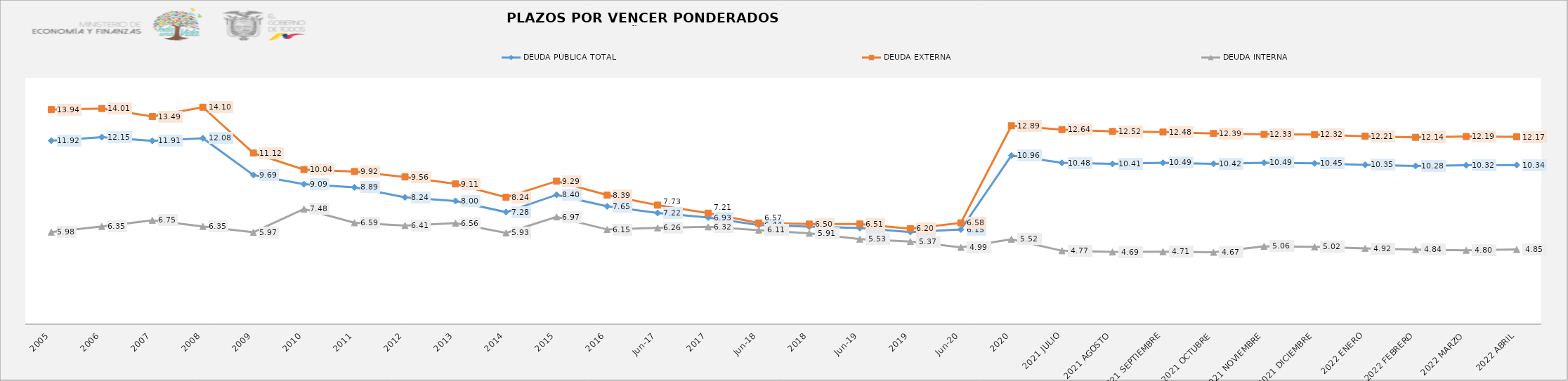
| Category | DEUDA PÚBLICA TOTAL | DEUDA EXTERNA  | DEUDA INTERNA |
|---|---|---|---|
| 2005 | 11.92 | 13.939 | 5.98 |
| 2006 | 12.15 | 14.01 | 6.35 |
| 2007 | 11.91 | 13.489 | 6.75 |
| 2008 | 12.08 | 14.097 | 6.35 |
| 2009 | 9.69 | 11.12 | 5.97 |
| 2010 | 9.09 | 10.045 | 7.48 |
| 2011 | 8.889 | 9.918 | 6.59 |
| 2012 | 8.237 | 9.564 | 6.41 |
| 2013 | 8.003 | 9.112 | 6.56 |
| 2014 | 7.278 | 8.241 | 5.93 |
| 2015 | 8.401 | 9.29 | 6.969 |
| 2016 | 7.655 | 8.385 | 6.149 |
| jun-17 | 7.224 | 7.733 | 6.257 |
| 2017 | 6.927 | 7.21 | 6.32 |
| jun-18 | 6.439 | 6.574 | 6.111 |
| 2018 | 6.337 | 6.503 | 5.906 |
| jun-19 | 6.246 | 6.509 | 5.526 |
| 2019 | 5.988 | 6.201 | 5.368 |
| jun-20 | 6.152 | 6.581 | 4.989 |
| 2020 | 10.957 | 12.887 | 5.519 |
| 2021 JULIO | 10.48 | 12.64 | 4.77 |
| 2021 AGOSTO | 10.414 | 12.52 | 4.69 |
| 2021 SEPTIEMBRE | 10.49 | 12.48 | 4.71 |
| 2021 OCTUBRE | 10.42 | 12.39 | 4.67 |
| 2021 NOVIEMBRE | 10.49 | 12.33 | 5.06 |
| 2021 DICIEMBRE | 10.45 | 12.32 | 5.02 |
| 2022 ENERO | 10.35 | 12.21 | 4.92 |
| 2022 FEBRERO | 10.28 | 12.14 | 4.84 |
| 2022 MARZO | 10.32 | 12.19 | 4.8 |
| 2022 ABRIL | 10.34 | 12.17 | 4.85 |